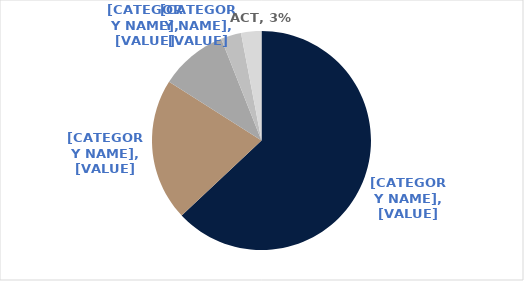
| Category | Series 0 |
|---|---|
| NSW | 0.63 |
| VIC | 0.21 |
| QLD | 0.1 |
| WA | 0.03 |
| ACT | 0.03 |